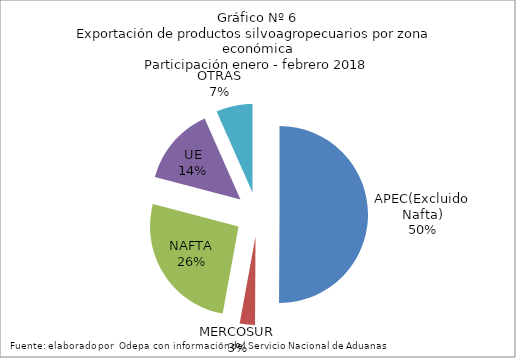
| Category | Series 0 |
|---|---|
| APEC(Excluido Nafta) | 1666985.014 |
| MERCOSUR | 92423.297 |
| NAFTA | 872266.962 |
| UE | 475483.586 |
| OTRAS | 221155.14 |